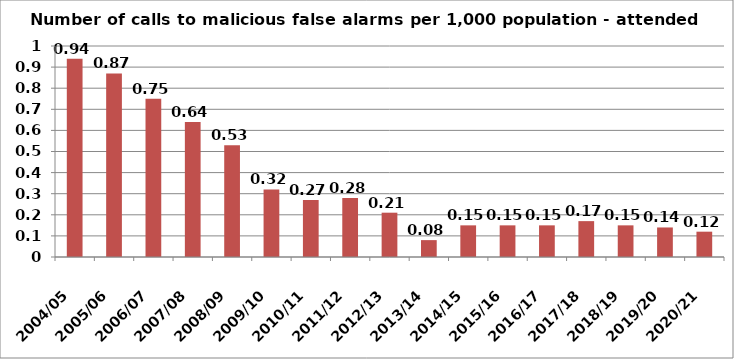
| Category | Series 0 |
|---|---|
| 2004/05 | 0.94 |
| 2005/06 | 0.87 |
| 2006/07 | 0.75 |
| 2007/08 | 0.64 |
| 2008/09 | 0.53 |
| 2009/10 | 0.32 |
| 2010/11 | 0.27 |
| 2011/12 | 0.28 |
| 2012/13 | 0.21 |
| 2013/14 | 0.08 |
| 2014/15 | 0.15 |
| 2015/16 | 0.15 |
| 2016/17 | 0.15 |
| 2017/18 | 0.17 |
| 2018/19 | 0.15 |
| 2019/20 | 0.14 |
| 2020/21 | 0.12 |